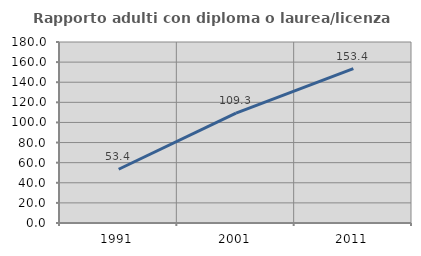
| Category | Rapporto adulti con diploma o laurea/licenza media  |
|---|---|
| 1991.0 | 53.435 |
| 2001.0 | 109.337 |
| 2011.0 | 153.438 |